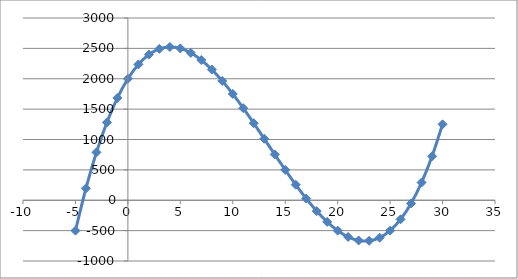
| Category | Series 0 |
|---|---|
| -5.0 | -500 |
| -4.0 | 196 |
| -3.0 | 788 |
| -2.0 | 1282 |
| -1.0 | 1684 |
| 0.0 | 2000 |
| 1.0 | 2236 |
| 2.0 | 2398 |
| 3.0 | 2492 |
| 4.0 | 2524 |
| 5.0 | 2500 |
| 6.0 | 2426 |
| 7.0 | 2308 |
| 8.0 | 2152 |
| 9.0 | 1964 |
| 10.0 | 1750 |
| 11.0 | 1516 |
| 12.0 | 1268 |
| 13.0 | 1012 |
| 14.0 | 754 |
| 15.0 | 500 |
| 16.0 | 256 |
| 17.0 | 28 |
| 18.0 | -178 |
| 19.0 | -356 |
| 20.0 | -500 |
| 21.0 | -604 |
| 22.0 | -662 |
| 23.0 | -668 |
| 24.0 | -616 |
| 25.0 | -500 |
| 26.0 | -314 |
| 27.0 | -52 |
| 28.0 | 292 |
| 29.0 | 724 |
| 30.0 | 1250 |